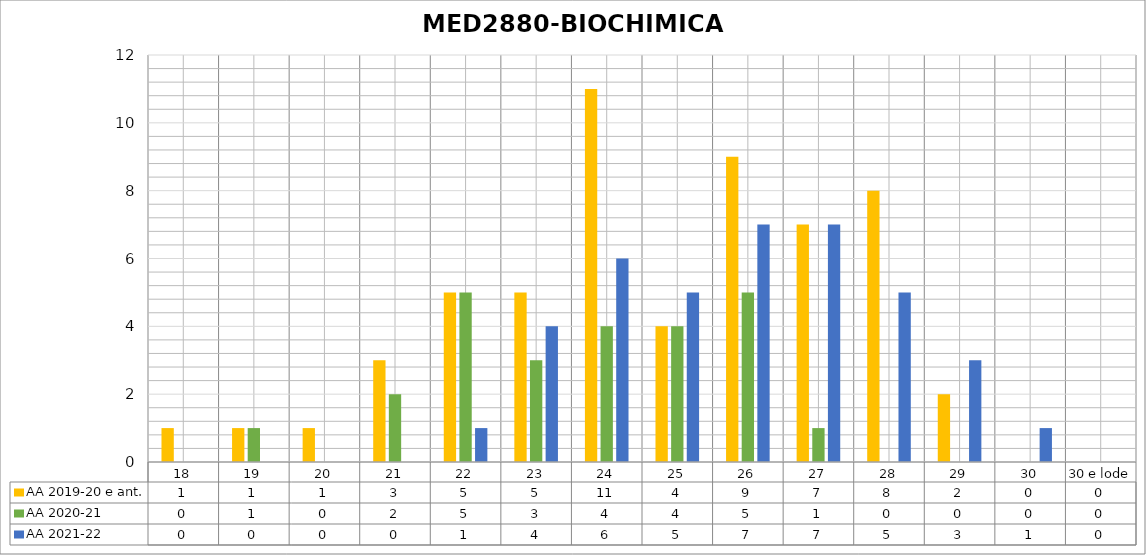
| Category | AA 2019-20 e ant. | AA 2020-21 | AA 2021-22 |
|---|---|---|---|
| 18 | 1 | 0 | 0 |
| 19 | 1 | 1 | 0 |
| 20 | 1 | 0 | 0 |
| 21 | 3 | 2 | 0 |
| 22 | 5 | 5 | 1 |
| 23 | 5 | 3 | 4 |
| 24 | 11 | 4 | 6 |
| 25 | 4 | 4 | 5 |
| 26 | 9 | 5 | 7 |
| 27 | 7 | 1 | 7 |
| 28 | 8 | 0 | 5 |
| 29 | 2 | 0 | 3 |
| 30 | 0 | 0 | 1 |
| 30 e lode | 0 | 0 | 0 |